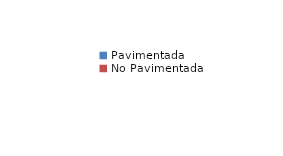
| Category | RV Vecinal |
|---|---|
| Pavimentada | 566.044 |
| No Pavimentada | 26243.373 |